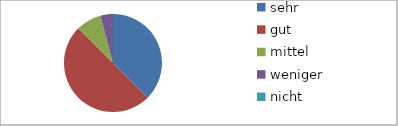
| Category | Series 0 |
|---|---|
| sehr | 9 |
| gut | 12 |
| mittel | 2 |
| weniger | 1 |
| nicht | 0 |
| kann ich nicht beurteilen | 0 |
| keine Angabe | 0 |